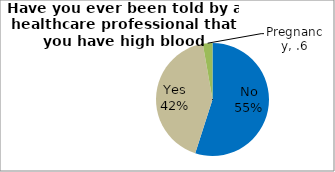
| Category | Series 0 |
|---|---|
| No | 54.946 |
| Yes | 42.297 |
| Pregnancy | 2.757 |